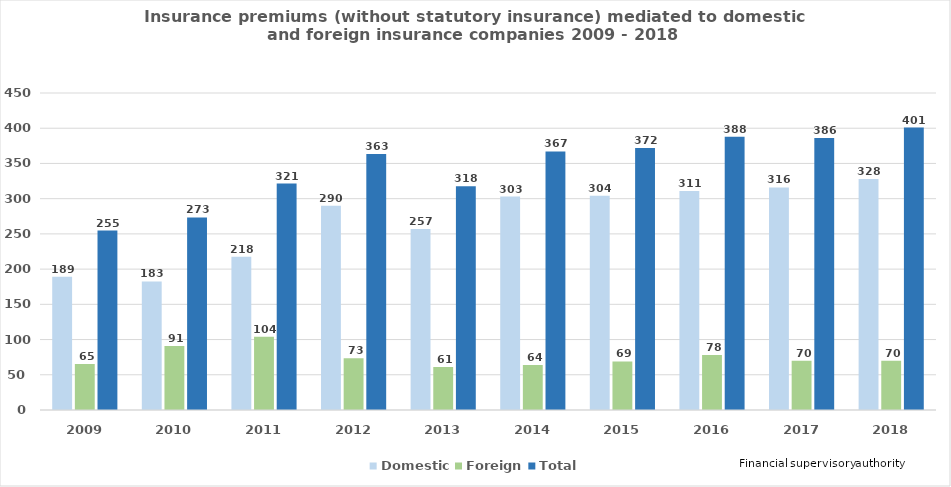
| Category | Domestic | Foreign | Total |
|---|---|---|---|
| 2009.0 | 189.249 | 65.417 | 254.666 |
| 2010.0 | 182.562 | 90.729 | 273.291 |
| 2011.0 | 217.55 | 103.894 | 321.444 |
| 2012.0 | 289.922 | 73.321 | 363.243 |
| 2013.0 | 257 | 61 | 317.523 |
| 2014.0 | 303 | 64 | 367 |
| 2015.0 | 304 | 69 | 372 |
| 2016.0 | 311 | 78 | 388 |
| 2017.0 | 316 | 70 | 386 |
| 2018.0 | 328 | 70 | 401 |